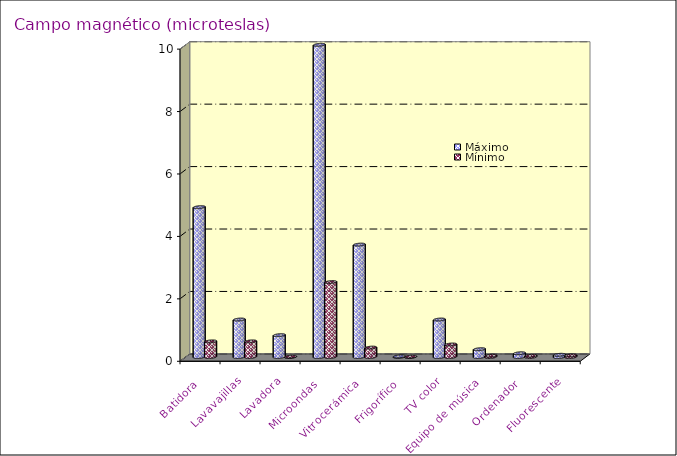
| Category | Máximo | Mínimo |
|---|---|---|
| Batidora | 4.8 | 0.5 |
| Lavavajillas | 1.2 | 0.5 |
| Lavadora | 0.7 | 0.01 |
| Microondas | 10 | 2.4 |
| Vitrocerámica | 3.6 | 0.3 |
| Frigorífico | 0.02 | 0.01 |
| TV color | 1.2 | 0.4 |
| Equipo de música | 0.25 | 0.04 |
| Ordenador | 0.12 | 0.04 |
| Fluorescente | 0.07 | 0.05 |